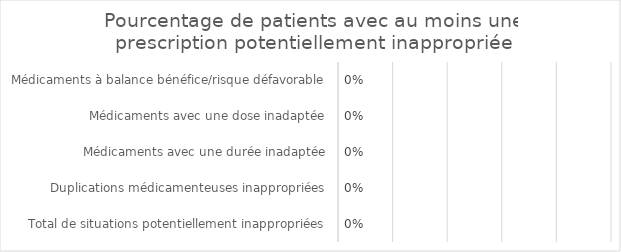
| Category | Pourcentage de patients avec au moins une prescription potentiellement inappropriée |
|---|---|
| Médicaments à balance bénéfice/risque défavorable | 0 |
| Médicaments avec une dose inadaptée | 0 |
| Médicaments avec une durée inadaptée | 0 |
| Duplications médicamenteuses inappropriées | 0 |
| Total de situations potentiellement inappropriées | 0 |